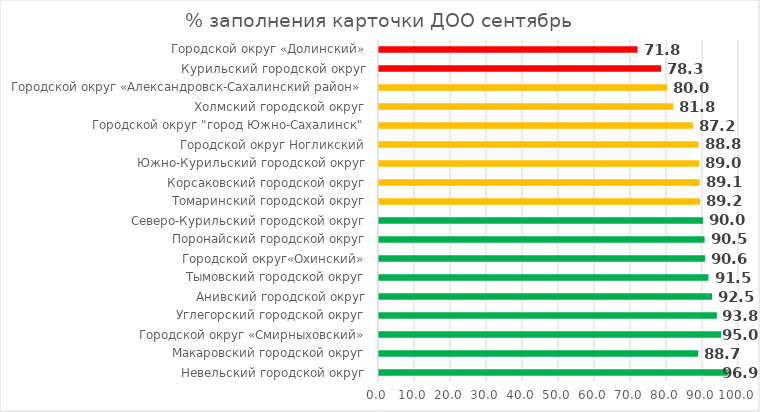
| Category | Series 0 |
|---|---|
| Невельский городской округ | 96.852 |
| Макаровский городской округ | 88.667 |
| Городской округ «Смирныховский» | 95 |
| Углегорский городской округ | 93.846 |
| Анивский городской округ | 92.5 |
| Тымовский городской округ | 91.538 |
| Городской округ«Охинский» | 90.556 |
| Поронайский городской округ | 90.455 |
| Северо-Курильский городской округ | 90 |
| Томаринский городской округ | 89.167 |
| Корсаковский городской округ | 89.111 |
| Южно-Курильский городской округ | 88.958 |
| Городской округ Ногликский | 88.75 |
| Городской округ "город Южно-Сахалинск" | 87.201 |
| Холмский городской округ | 81.771 |
| Городской округ «Александровск-Сахалинский район»  | 80 |
| Курильский городской округ | 78.333 |
| Городской округ «Долинский» | 71.818 |